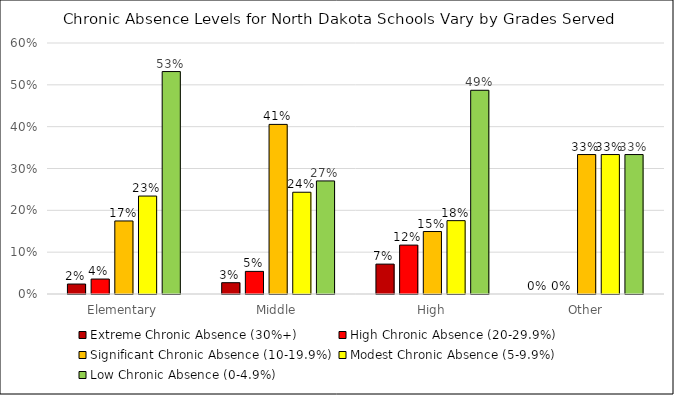
| Category | Extreme Chronic Absence (30%+) | High Chronic Absence (20-29.9%) | Significant Chronic Absence (10-19.9%) | Modest Chronic Absence (5-9.9%) | Low Chronic Absence (0-4.9%) |
|---|---|---|---|---|---|
| Elementary | 0.024 | 0.036 | 0.175 | 0.234 | 0.532 |
| Middle | 0.027 | 0.054 | 0.405 | 0.243 | 0.27 |
| High | 0.071 | 0.117 | 0.149 | 0.175 | 0.487 |
| Other | 0 | 0 | 0.333 | 0.333 | 0.333 |